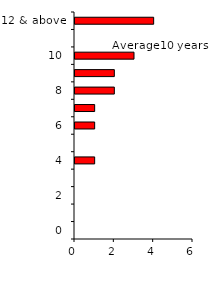
| Category | Series 0 |
|---|---|
| 0 | 0 |
| 1 | 0 |
| 2 | 0 |
| 3 | 0 |
| 4 | 1 |
| 5 | 0 |
| 6 | 1 |
| 7 | 1 |
| 8 | 2 |
| 9 | 2 |
| 10 | 3 |
| 11 | 0 |
| 12 & above | 4 |